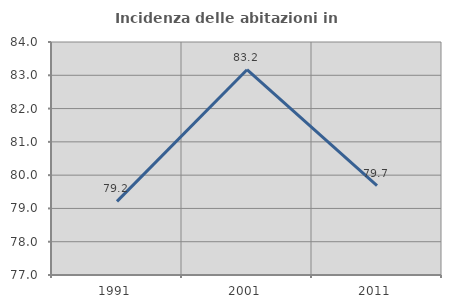
| Category | Incidenza delle abitazioni in proprietà  |
|---|---|
| 1991.0 | 79.211 |
| 2001.0 | 83.168 |
| 2011.0 | 79.683 |